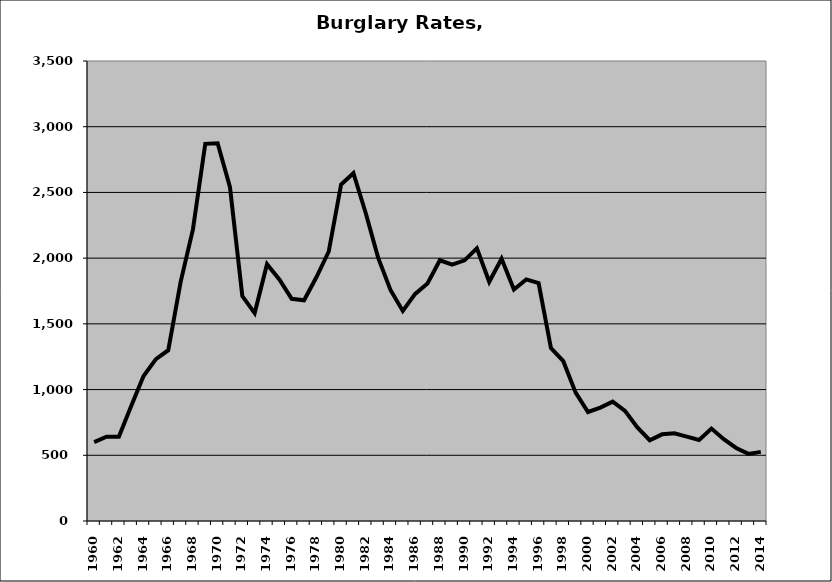
| Category | Burglary |
|---|---|
| 1960.0 | 600.427 |
| 1961.0 | 641.66 |
| 1962.0 | 640.561 |
| 1963.0 | 875.188 |
| 1964.0 | 1102.723 |
| 1965.0 | 1231.133 |
| 1966.0 | 1299.257 |
| 1967.0 | 1817.305 |
| 1968.0 | 2218.789 |
| 1969.0 | 2869.925 |
| 1970.0 | 2873.723 |
| 1971.0 | 2539.541 |
| 1972.0 | 1711.364 |
| 1973.0 | 1581.903 |
| 1974.0 | 1953.804 |
| 1975.0 | 1838.547 |
| 1976.0 | 1690.741 |
| 1977.0 | 1679.71 |
| 1978.0 | 1854.154 |
| 1979.0 | 2050.61 |
| 1980.0 | 2559.691 |
| 1981.0 | 2646.541 |
| 1982.0 | 2341.363 |
| 1983.0 | 2003.692 |
| 1984.0 | 1758.266 |
| 1985.0 | 1598.243 |
| 1986.0 | 1727.636 |
| 1987.0 | 1807.717 |
| 1988.0 | 1983.871 |
| 1989.0 | 1950.331 |
| 1990.0 | 1983.029 |
| 1991.0 | 2074.415 |
| 1992.0 | 1820.204 |
| 1993.0 | 1995.502 |
| 1994.0 | 1760.877 |
| 1995.0 | 1838.448 |
| 1996.0 | 1809.945 |
| 1997.0 | 1316.257 |
| 1998.0 | 1216.252 |
| 1999.0 | 976.301 |
| 2000.0 | 829.46 |
| 2001.0 | 862.463 |
| 2002.0 | 908.361 |
| 2003.0 | 837.667 |
| 2004.0 | 711.967 |
| 2005.0 | 614.553 |
| 2006.0 | 659.467 |
| 2007.0 | 667.356 |
| 2008.0 | 641.953 |
| 2009.0 | 616.352 |
| 2010.0 | 703.147 |
| 2011.0 | 621.951 |
| 2012.0 | 555.549 |
| 2013.0 | 510.853 |
| 2014.0 | 526.034 |